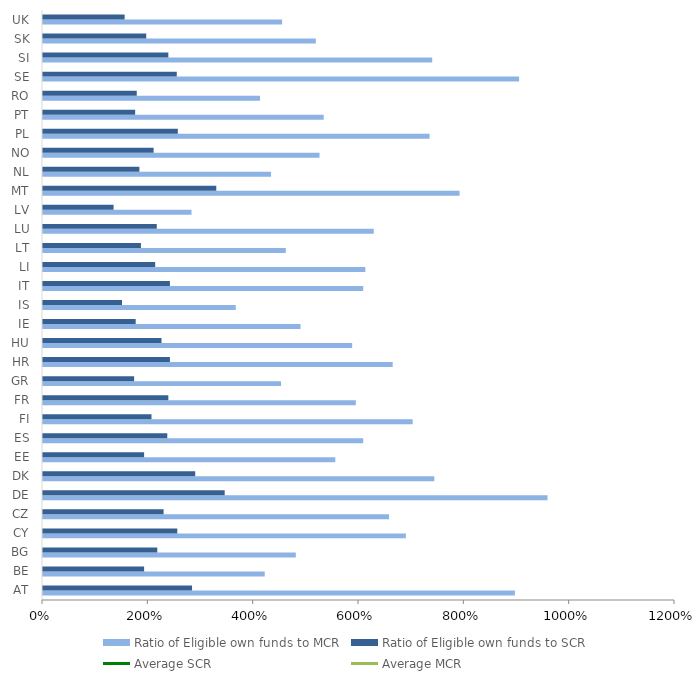
| Category | Ratio of Eligible own funds to MCR | Ratio of Eligible own funds to SCR |
|---|---|---|
| AT | 8.96 | 2.83 |
| BE | 4.21 | 1.92 |
| BG | 4.8 | 2.17 |
| CY | 6.89 | 2.55 |
| CZ | 6.57 | 2.29 |
| DE | 9.58 | 3.45 |
| DK | 7.43 | 2.89 |
| EE | 5.55 | 1.92 |
| ES | 6.08 | 2.36 |
| FI | 7.02 | 2.06 |
| FR | 5.94 | 2.38 |
| GR | 4.52 | 1.73 |
| HR | 6.64 | 2.41 |
| HU | 5.87 | 2.25 |
| IE | 4.89 | 1.76 |
| IS | 3.66 | 1.5 |
| IT | 6.08 | 2.41 |
| LI | 6.12 | 2.13 |
| LT | 4.61 | 1.86 |
| LU | 6.28 | 2.16 |
| LV | 2.82 | 1.34 |
| MT | 7.91 | 3.29 |
| NL | 4.33 | 1.83 |
| NO | 5.25 | 2.1 |
| PL | 7.34 | 2.56 |
| PT | 5.33 | 1.75 |
| RO | 4.12 | 1.78 |
| SE | 9.04 | 2.54 |
| SI | 7.39 | 2.38 |
| SK | 5.18 | 1.96 |
| UK | 4.54 | 1.55 |